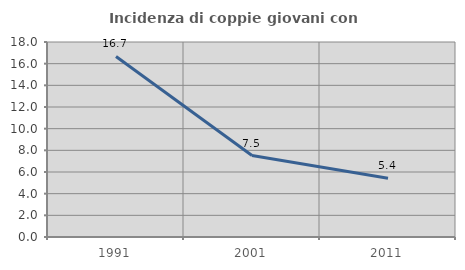
| Category | Incidenza di coppie giovani con figli |
|---|---|
| 1991.0 | 16.667 |
| 2001.0 | 7.52 |
| 2011.0 | 5.428 |